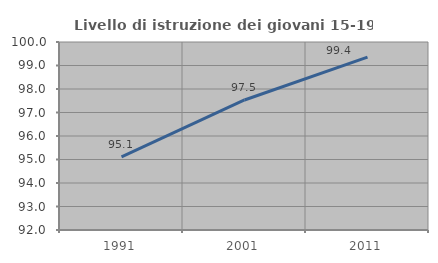
| Category | Livello di istruzione dei giovani 15-19 anni |
|---|---|
| 1991.0 | 95.111 |
| 2001.0 | 97.533 |
| 2011.0 | 99.354 |